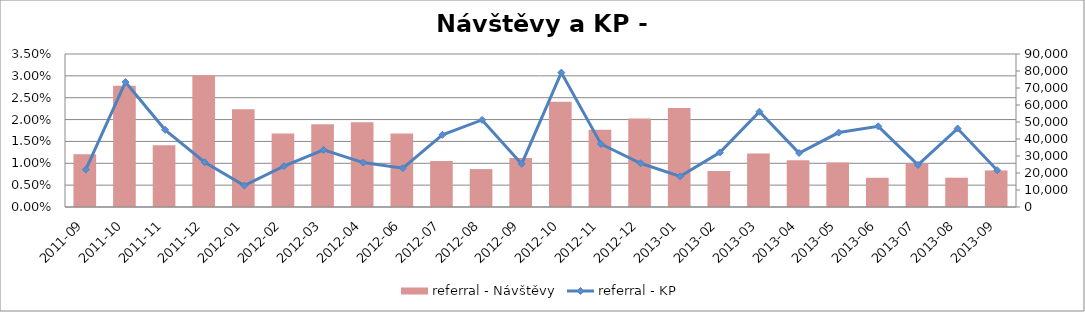
| Category | referral - Návštěvy |
|---|---|
| 2011-09 | 31069.247 |
| 2011-10 | 71311.918 |
| 2011-11 | 36338.716 |
| 2011-12 | 77470.338 |
| 2012-01 | 57569.468 |
| 2012-02 | 43252.298 |
| 2012-03 | 48671.334 |
| 2012-04 | 49798.051 |
| 2012-06 | 43164.894 |
| 2012-07 | 27051.121 |
| 2012-08 | 22305.048 |
| 2012-09 | 28821.02 |
| 2012-10 | 61869.717 |
| 2012-11 | 45459.014 |
| 2012-12 | 52086.904 |
| 2013-01 | 58261.373 |
| 2013-02 | 21162.935 |
| 2013-03 | 31541.839 |
| 2013-04 | 27561.265 |
| 2013-05 | 26147.826 |
| 2013-06 | 17205.48 |
| 2013-07 | 25381.164 |
| 2013-08 | 17225.168 |
| 2013-09 | 21490.638 |